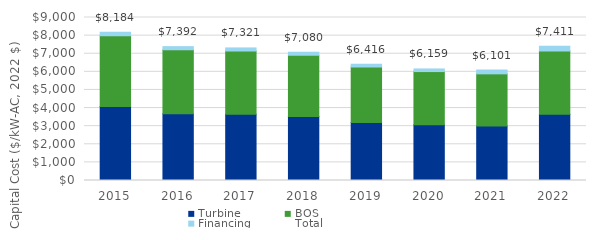
| Category | Turbine | BOS | Financing |
|---|---|---|---|
| 2015.0 | 4083.95 | 3908.124 | 191.829 |
| 2016.0 | 3688.627 | 3529.822 | 173.26 |
| 2017.0 | 3653.143 | 3495.865 | 171.593 |
| 2018.0 | 3533.155 | 3381.043 | 165.957 |
| 2019.0 | 3201.884 | 3064.034 | 150.397 |
| 2020.0 | 3073.382 | 2941.064 | 144.361 |
| 2021.0 | 3009.426 | 2879.862 | 211.502 |
| 2022.0 | 3655.565 | 3498.183 | 256.913 |